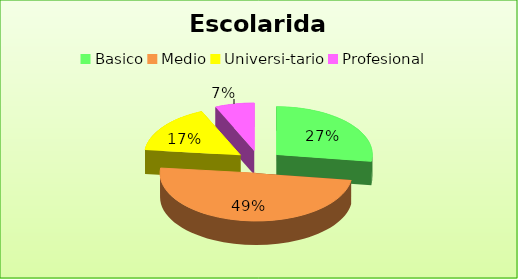
| Category | Series 0 |
|---|---|
| Basico | 0.273 |
| Medio | 0.494 |
| Universi-tario | 0.167 |
| Profesional | 0.066 |